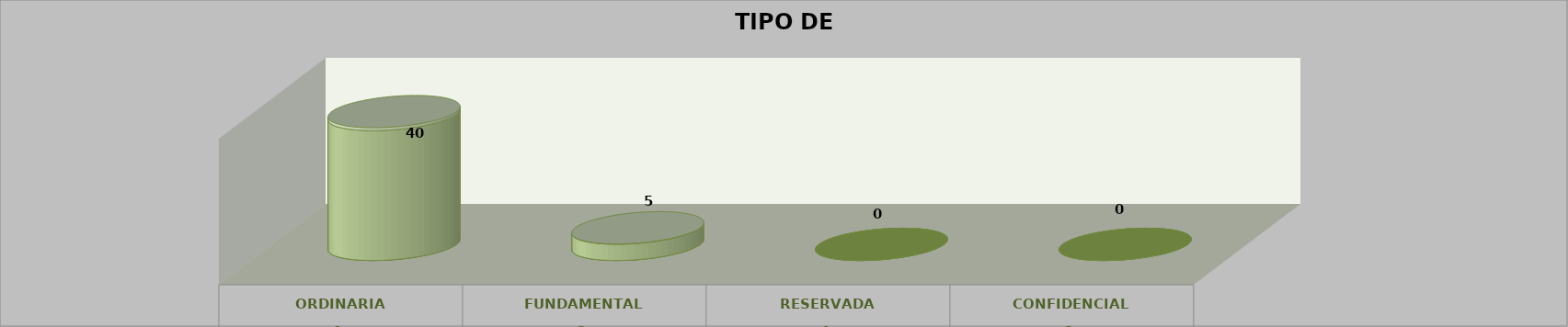
| Category | Series 0 | Series 2 | Series 1 | Series 3 | Series 4 |
|---|---|---|---|---|---|
| 0 |  |  |  | 40 | 0.889 |
| 1 |  |  |  | 5 | 0.111 |
| 2 |  |  |  | 0 | 0 |
| 3 |  |  |  | 0 | 0 |